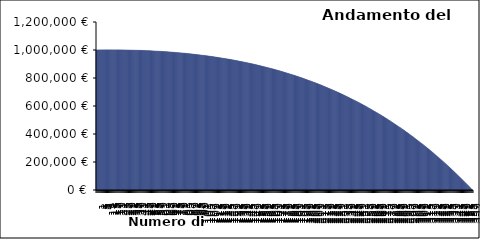
| Category | Saldo |
|---|---|
| 1.0 | 1000110.045 |
| 2.0 | 1000212.399 |
| 3.0 | 1000307.016 |
| 4.0 | 1000393.85 |
| 5.0 | 1000472.854 |
| 6.0 | 1000543.982 |
| 7.0 | 1000607.189 |
| 8.0 | 1000662.426 |
| 9.0 | 1000709.646 |
| 10.0 | 1000748.804 |
| 11.0 | 1000779.85 |
| 12.0 | 1000802.738 |
| 13.0 | 1000817.42 |
| 14.0 | 1000823.847 |
| 15.0 | 1000821.972 |
| 16.0 | 1000811.746 |
| 17.0 | 1000793.12 |
| 18.0 | 1000766.045 |
| 19.0 | 1000730.472 |
| 20.0 | 1000686.352 |
| 21.0 | 1000633.635 |
| 22.0 | 1000572.271 |
| 23.0 | 1000502.211 |
| 24.0 | 1000423.404 |
| 25.0 | 1000335.8 |
| 26.0 | 1000239.349 |
| 27.0 | 1000133.998 |
| 28.0 | 1000019.697 |
| 29.0 | 999896.396 |
| 30.0 | 999764.041 |
| 31.0 | 999622.582 |
| 32.0 | 999471.966 |
| 33.0 | 999312.142 |
| 34.0 | 999143.056 |
| 35.0 | 998964.657 |
| 36.0 | 998776.89 |
| 37.0 | 998579.704 |
| 38.0 | 998373.044 |
| 39.0 | 998156.857 |
| 40.0 | 997931.09 |
| 41.0 | 997695.687 |
| 42.0 | 997450.595 |
| 43.0 | 997195.759 |
| 44.0 | 996931.125 |
| 45.0 | 996656.637 |
| 46.0 | 996372.24 |
| 47.0 | 996077.878 |
| 48.0 | 995773.497 |
| 49.0 | 995459.039 |
| 50.0 | 995134.449 |
| 51.0 | 994799.669 |
| 52.0 | 994454.645 |
| 53.0 | 994099.317 |
| 54.0 | 993733.63 |
| 55.0 | 993357.525 |
| 56.0 | 992970.945 |
| 57.0 | 992573.832 |
| 58.0 | 992166.128 |
| 59.0 | 991747.774 |
| 60.0 | 991318.712 |
| 61.0 | 990878.882 |
| 62.0 | 990428.226 |
| 63.0 | 989966.683 |
| 64.0 | 989494.195 |
| 65.0 | 989010.701 |
| 66.0 | 988516.14 |
| 67.0 | 988010.453 |
| 68.0 | 987493.578 |
| 69.0 | 986965.455 |
| 70.0 | 986426.022 |
| 71.0 | 985875.218 |
| 72.0 | 985312.98 |
| 73.0 | 984739.247 |
| 74.0 | 984153.956 |
| 75.0 | 983557.045 |
| 76.0 | 982948.451 |
| 77.0 | 982328.11 |
| 78.0 | 981695.96 |
| 79.0 | 981051.935 |
| 80.0 | 980395.973 |
| 81.0 | 979728.01 |
| 82.0 | 979047.979 |
| 83.0 | 978355.818 |
| 84.0 | 977651.46 |
| 85.0 | 976934.841 |
| 86.0 | 976205.894 |
| 87.0 | 975464.554 |
| 88.0 | 974710.754 |
| 89.0 | 973944.428 |
| 90.0 | 973165.51 |
| 91.0 | 972373.931 |
| 92.0 | 971569.625 |
| 93.0 | 970752.525 |
| 94.0 | 969922.561 |
| 95.0 | 969079.667 |
| 96.0 | 968223.773 |
| 97.0 | 967354.81 |
| 98.0 | 966472.71 |
| 99.0 | 965577.404 |
| 100.0 | 964668.82 |
| 101.0 | 963746.89 |
| 102.0 | 962811.543 |
| 103.0 | 961862.709 |
| 104.0 | 960900.317 |
| 105.0 | 959924.295 |
| 106.0 | 958934.572 |
| 107.0 | 957931.076 |
| 108.0 | 956913.736 |
| 109.0 | 955882.478 |
| 110.0 | 954837.23 |
| 111.0 | 953777.92 |
| 112.0 | 952704.473 |
| 113.0 | 951616.816 |
| 114.0 | 950514.875 |
| 115.0 | 949398.576 |
| 116.0 | 948267.845 |
| 117.0 | 947122.605 |
| 118.0 | 945962.783 |
| 119.0 | 944788.303 |
| 120.0 | 943599.089 |
| 121.0 | 942395.064 |
| 122.0 | 941176.152 |
| 123.0 | 939942.277 |
| 124.0 | 938693.361 |
| 125.0 | 937429.327 |
| 126.0 | 936150.097 |
| 127.0 | 934855.593 |
| 128.0 | 933545.736 |
| 129.0 | 932220.448 |
| 130.0 | 930879.65 |
| 131.0 | 929523.262 |
| 132.0 | 928151.204 |
| 133.0 | 926763.396 |
| 134.0 | 925359.759 |
| 135.0 | 923940.21 |
| 136.0 | 922504.67 |
| 137.0 | 921053.055 |
| 138.0 | 919585.286 |
| 139.0 | 918101.279 |
| 140.0 | 916600.953 |
| 141.0 | 915084.223 |
| 142.0 | 913551.008 |
| 143.0 | 912001.223 |
| 144.0 | 910434.785 |
| 145.0 | 908851.609 |
| 146.0 | 907251.611 |
| 147.0 | 905634.706 |
| 148.0 | 904000.809 |
| 149.0 | 902349.833 |
| 150.0 | 900681.694 |
| 151.0 | 898996.304 |
| 152.0 | 897293.577 |
| 153.0 | 895573.426 |
| 154.0 | 893835.763 |
| 155.0 | 892080.501 |
| 156.0 | 890307.551 |
| 157.0 | 888516.825 |
| 158.0 | 886708.234 |
| 159.0 | 884881.688 |
| 160.0 | 883037.098 |
| 161.0 | 881174.374 |
| 162.0 | 879293.426 |
| 163.0 | 877394.162 |
| 164.0 | 875476.492 |
| 165.0 | 873540.323 |
| 166.0 | 871585.565 |
| 167.0 | 869612.125 |
| 168.0 | 867619.909 |
| 169.0 | 865608.826 |
| 170.0 | 863578.781 |
| 171.0 | 861529.68 |
| 172.0 | 859461.431 |
| 173.0 | 857373.937 |
| 174.0 | 855267.103 |
| 175.0 | 853140.835 |
| 176.0 | 850995.037 |
| 177.0 | 848829.612 |
| 178.0 | 846644.464 |
| 179.0 | 844439.495 |
| 180.0 | 842214.609 |
| 181.0 | 839969.707 |
| 182.0 | 837704.691 |
| 183.0 | 835419.463 |
| 184.0 | 833113.924 |
| 185.0 | 830787.974 |
| 186.0 | 828441.514 |
| 187.0 | 826074.442 |
| 188.0 | 823686.659 |
| 189.0 | 821278.063 |
| 190.0 | 818848.553 |
| 191.0 | 816398.027 |
| 192.0 | 813926.382 |
| 193.0 | 811433.516 |
| 194.0 | 808919.326 |
| 195.0 | 806383.707 |
| 196.0 | 803826.557 |
| 197.0 | 801247.77 |
| 198.0 | 798647.241 |
| 199.0 | 796024.866 |
| 200.0 | 793380.538 |
| 201.0 | 790714.151 |
| 202.0 | 788025.599 |
| 203.0 | 785314.774 |
| 204.0 | 782581.569 |
| 205.0 | 779825.876 |
| 206.0 | 777047.587 |
| 207.0 | 774246.593 |
| 208.0 | 771422.784 |
| 209.0 | 768576.051 |
| 210.0 | 765706.283 |
| 211.0 | 762813.371 |
| 212.0 | 759897.202 |
| 213.0 | 756957.665 |
| 214.0 | 753994.649 |
| 215.0 | 751008.04 |
| 216.0 | 747997.726 |
| 217.0 | 744963.594 |
| 218.0 | 741905.529 |
| 219.0 | 738823.417 |
| 220.0 | 735717.144 |
| 221.0 | 732586.594 |
| 222.0 | 729431.652 |
| 223.0 | 726252.201 |
| 224.0 | 723048.124 |
| 225.0 | 719819.305 |
| 226.0 | 716565.626 |
| 227.0 | 713286.968 |
| 228.0 | 709983.214 |
| 229.0 | 706654.243 |
| 230.0 | 703299.937 |
| 231.0 | 699920.176 |
| 232.0 | 696514.838 |
| 233.0 | 693083.803 |
| 234.0 | 689626.95 |
| 235.0 | 686144.156 |
| 236.0 | 682635.299 |
| 237.0 | 679100.255 |
| 238.0 | 675538.902 |
| 239.0 | 671951.115 |
| 240.0 | 668336.77 |
| 241.0 | 664695.741 |
| 242.0 | 661027.904 |
| 243.0 | 657333.132 |
| 244.0 | 653611.299 |
| 245.0 | 649862.277 |
| 246.0 | 646085.939 |
| 247.0 | 642282.156 |
| 248.0 | 638450.801 |
| 249.0 | 634591.745 |
| 250.0 | 630704.856 |
| 251.0 | 626790.006 |
| 252.0 | 622847.063 |
| 253.0 | 618875.897 |
| 254.0 | 614876.374 |
| 255.0 | 610848.365 |
| 256.0 | 606791.734 |
| 257.0 | 602706.349 |
| 258.0 | 598592.077 |
| 259.0 | 594448.782 |
| 260.0 | 590276.329 |
| 261.0 | 586074.583 |
| 262.0 | 581843.408 |
| 263.0 | 577582.668 |
| 264.0 | 573292.224 |
| 265.0 | 568971.94 |
| 266.0 | 564621.676 |
| 267.0 | 560241.295 |
| 268.0 | 555830.656 |
| 269.0 | 551389.62 |
| 270.0 | 546918.045 |
| 271.0 | 542415.792 |
| 272.0 | 537882.718 |
| 273.0 | 533318.681 |
| 274.0 | 528723.537 |
| 275.0 | 524097.145 |
| 276.0 | 519439.359 |
| 277.0 | 514750.035 |
| 278.0 | 510029.029 |
| 279.0 | 505276.193 |
| 280.0 | 500491.383 |
| 281.0 | 495674.45 |
| 282.0 | 490825.248 |
| 283.0 | 485943.628 |
| 284.0 | 481029.442 |
| 285.0 | 476082.54 |
| 286.0 | 471102.773 |
| 287.0 | 466089.99 |
| 288.0 | 461044.039 |
| 289.0 | 455964.77 |
| 290.0 | 450852.03 |
| 291.0 | 445705.665 |
| 292.0 | 440525.524 |
| 293.0 | 435311.45 |
| 294.0 | 430063.29 |
| 295.0 | 424780.888 |
| 296.0 | 419464.088 |
| 297.0 | 414112.734 |
| 298.0 | 408726.668 |
| 299.0 | 403305.732 |
| 300.0 | 397849.769 |
| 301.0 | 392358.617 |
| 302.0 | 386832.119 |
| 303.0 | 381270.113 |
| 304.0 | 375672.439 |
| 305.0 | 370038.934 |
| 306.0 | 364369.436 |
| 307.0 | 358663.783 |
| 308.0 | 352921.81 |
| 309.0 | 347143.354 |
| 310.0 | 341328.249 |
| 311.0 | 335476.329 |
| 312.0 | 329587.429 |
| 313.0 | 323661.382 |
| 314.0 | 317698.019 |
| 315.0 | 311697.173 |
| 316.0 | 305658.674 |
| 317.0 | 299582.353 |
| 318.0 | 293468.04 |
| 319.0 | 287315.564 |
| 320.0 | 281124.753 |
| 321.0 | 274895.434 |
| 322.0 | 268627.435 |
| 323.0 | 262320.582 |
| 324.0 | 255974.7 |
| 325.0 | 249589.614 |
| 326.0 | 243165.149 |
| 327.0 | 236701.128 |
| 328.0 | 230197.374 |
| 329.0 | 223653.709 |
| 330.0 | 217069.955 |
| 331.0 | 210445.931 |
| 332.0 | 203781.458 |
| 333.0 | 197076.355 |
| 334.0 | 190330.441 |
| 335.0 | 183543.534 |
| 336.0 | 176715.45 |
| 337.0 | 169846.006 |
| 338.0 | 162935.018 |
| 339.0 | 155982.3 |
| 340.0 | 148987.667 |
| 341.0 | 141950.932 |
| 342.0 | 134871.908 |
| 343.0 | 127750.407 |
| 344.0 | 120586.24 |
| 345.0 | 113379.217 |
| 346.0 | 106129.148 |
| 347.0 | 98835.843 |
| 348.0 | 91499.108 |
| 349.0 | 84118.753 |
| 350.0 | 76694.582 |
| 351.0 | 69226.404 |
| 352.0 | 61714.021 |
| 353.0 | 54157.24 |
| 354.0 | 46555.863 |
| 355.0 | 38909.694 |
| 356.0 | 31218.533 |
| 357.0 | 23482.184 |
| 358.0 | 15700.445 |
| 359.0 | 7873.118 |
| 360.0 | 0 |